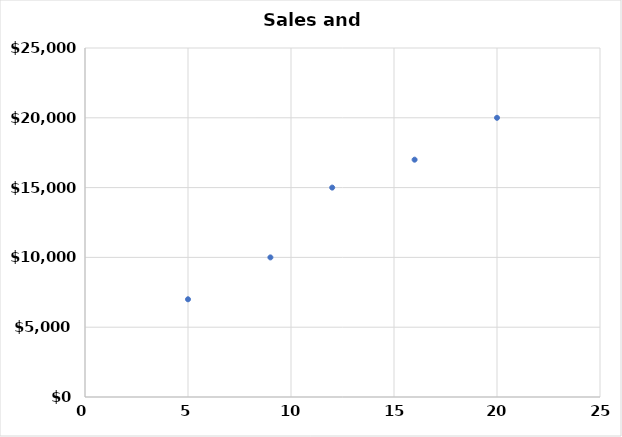
| Category | Quantity |
|---|---|
| 20.0 | 20000 |
| 16.0 | 17000 |
| 12.0 | 15000 |
| 9.0 | 10000 |
| 5.0 | 7000 |